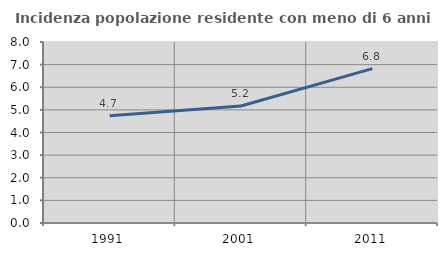
| Category | Incidenza popolazione residente con meno di 6 anni |
|---|---|
| 1991.0 | 4.745 |
| 2001.0 | 5.169 |
| 2011.0 | 6.821 |